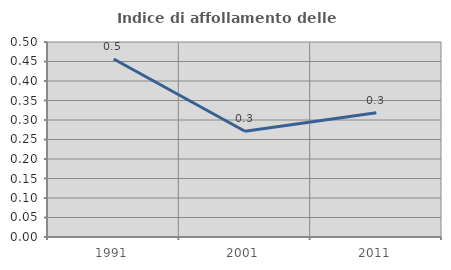
| Category | Indice di affollamento delle abitazioni  |
|---|---|
| 1991.0 | 0.456 |
| 2001.0 | 0.271 |
| 2011.0 | 0.318 |